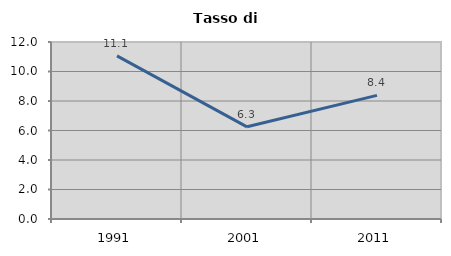
| Category | Tasso di disoccupazione   |
|---|---|
| 1991.0 | 11.056 |
| 2001.0 | 6.25 |
| 2011.0 | 8.38 |